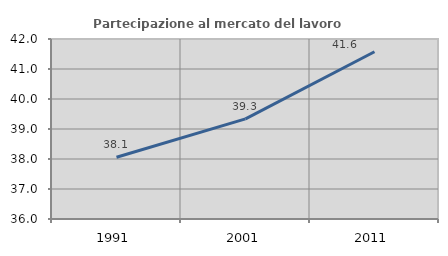
| Category | Partecipazione al mercato del lavoro  femminile |
|---|---|
| 1991.0 | 38.059 |
| 2001.0 | 39.337 |
| 2011.0 | 41.575 |